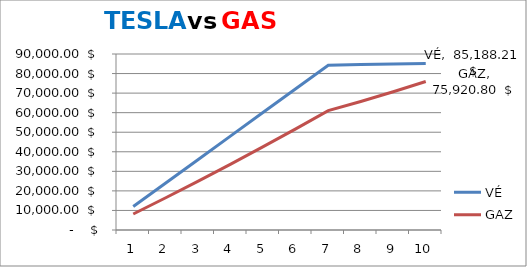
| Category | VÉ | GAZ |
|---|---|---|
| 0 | 12025.58 | 8168.44 |
| 1 | 24056.27 | 16504.88 |
| 2 | 36092.172 | 25017.72 |
| 3 | 48133.391 | 33715.78 |
| 4 | 60180.032 | 42608.321 |
| 5 | 72232.205 | 51705.067 |
| 6 | 84290.019 | 61016.228 |
| 7 | 84583.509 | 65744.086 |
| 8 | 84882.868 | 70708.336 |
| 9 | 85188.214 | 75920.799 |